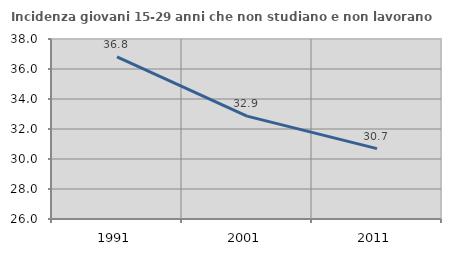
| Category | Incidenza giovani 15-29 anni che non studiano e non lavorano  |
|---|---|
| 1991.0 | 36.802 |
| 2001.0 | 32.861 |
| 2011.0 | 30.693 |